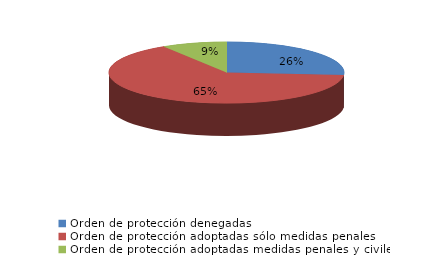
| Category | Series 0 |
|---|---|
| Orden de protección denegadas | 206 |
| Orden de protección adoptadas sólo medidas penales | 509 |
| Orden de protección adoptadas medidas penales y civiles | 70 |